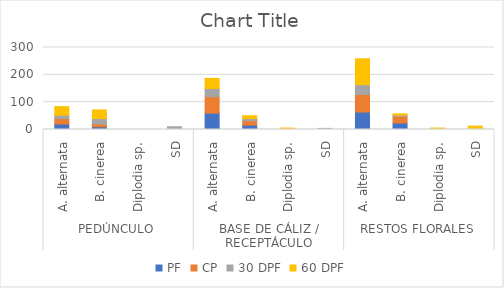
| Category | PF | CP | 30 DPF | 60 DPF |
|---|---|---|---|---|
| 0 | 20 | 20 | 12 | 31.58 |
| 1 | 10 | 10 | 20 | 31.58 |
| 2 | 0 | 0 | 0 | 0 |
| 3 | 0 | 0 | 10 | 0 |
| 4 | 60 | 60 | 30 | 36.84 |
| 5 | 16 | 16 | 8 | 10.53 |
| 6 | 0 | 0 | 0 | 5.26 |
| 7 | 0 | 0 | 4 | 0 |
| 8 | 64 | 64 | 36 | 94.74 |
| 9 | 24 | 24 | 4 | 5.26 |
| 10 | 0 | 0 | 0 | 5.26 |
| 11 | 0 | 0 | 2 | 10.53 |